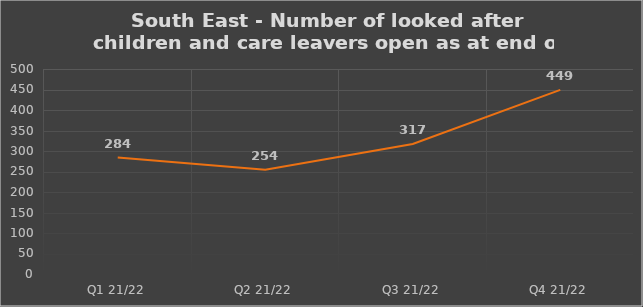
| Category | Number of open cases  |
|---|---|
| Q1 21/22 | 284 |
| Q2 21/22 | 254 |
| Q3 21/22 | 317 |
| Q4 21/22 | 449 |